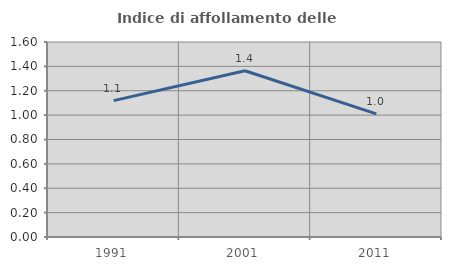
| Category | Indice di affollamento delle abitazioni  |
|---|---|
| 1991.0 | 1.119 |
| 2001.0 | 1.364 |
| 2011.0 | 1.01 |